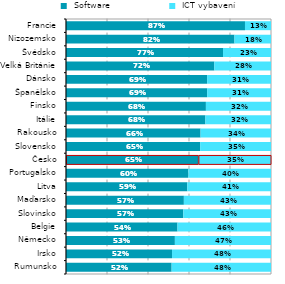
| Category |  Software |  ICT vybavení |
|---|---|---|
| Rumunsko | 0.515 | 0.485 |
| Irsko | 0.517 | 0.483 |
| Německo | 0.531 | 0.469 |
| Belgie | 0.544 | 0.456 |
| Slovinsko | 0.572 | 0.428 |
| Maďarsko | 0.575 | 0.425 |
| Litva | 0.592 | 0.408 |
| Portugalsko | 0.597 | 0.403 |
| Česko | 0.646 | 0.354 |
| Slovensko | 0.654 | 0.346 |
| Rakousko | 0.657 | 0.343 |
| Itálie | 0.68 | 0.32 |
| Finsko | 0.682 | 0.318 |
| Španělsko | 0.689 | 0.311 |
| Dánsko | 0.689 | 0.311 |
| Velká Británie | 0.724 | 0.276 |
| Švédsko | 0.766 | 0.234 |
| Nizozemsko | 0.822 | 0.178 |
| Francie | 0.873 | 0.127 |